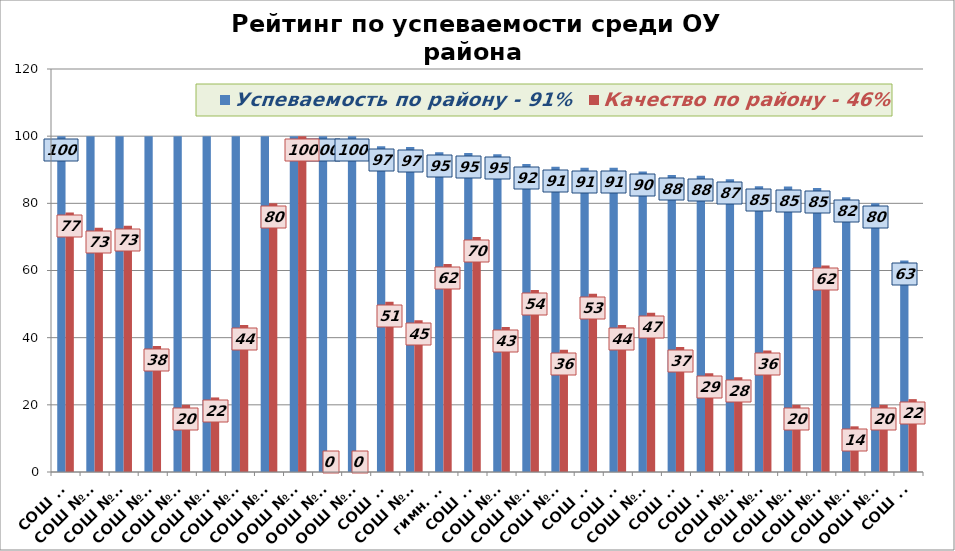
| Category | Успеваемость по району - 91% | Качество по району - 46% |
|---|---|---|
| СОШ №1 | 100 | 77.3 |
| СОШ №12 | 100 | 72.7 |
| СОШ №16 | 100 | 73.3 |
| СОШ №17 | 100 | 37.5 |
| СОШ №18 | 100 | 20 |
| СОШ №21 | 100 | 22.2 |
| СОШ №22 | 100 | 43.8 |
| СОШ №24 | 100 | 80 |
| ООШ №28 | 100 | 100 |
| ООШ №27 | 100 | 0 |
| ООШ №31 | 100 | 0 |
| СОШ №2 | 97 | 50.7 |
| СОШ №19 | 96.8 | 45.2 |
| гимн. №5 | 95.2 | 61.9 |
| СОШ №8 | 95 | 70 |
| СОШ №25 | 94.6 | 43.2 |
| СОШ №13 | 91.7 | 54.2 |
| СОШ №15 | 90.9 | 36.4 |
| СОШ №6 | 90.6 | 53.1 |
| СОШ №7 | 90.6 | 43.8 |
| СОШ №14 | 89.5 | 47.4 |
| СОШ №3 | 88.4 | 37.2 |
| СОШ №9 | 88.2 | 29.4 |
| СОШ №11 | 87.2 | 28.2 |
| СОШ №36 | 85.1 | 36.2 |
| СОШ №10 | 85 | 20 |
| СОШ №23 | 84.6 | 61.5 |
| СОШ №20 | 81.8 | 13.6 |
| ООШ №26 | 80 | 20 |
| СОШ №4 | 63 | 21.7 |